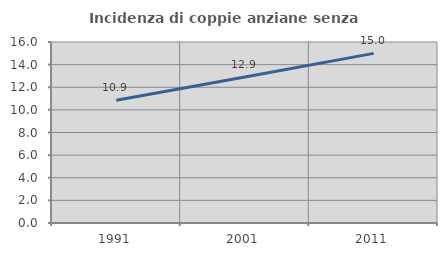
| Category | Incidenza di coppie anziane senza figli  |
|---|---|
| 1991.0 | 10.858 |
| 2001.0 | 12.899 |
| 2011.0 | 14.995 |